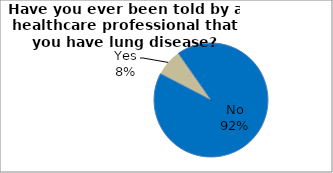
| Category | Series 0 |
|---|---|
| No | 92.36 |
| Yes | 7.64 |